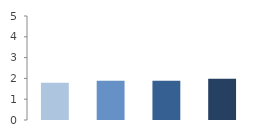
| Category | Rate (%) |
|---|---|
| 2009.0 | 1.789 |
| 2010.0 | 1.888 |
| 2011.0 | 1.889 |
| 2012.0 | 1.985 |